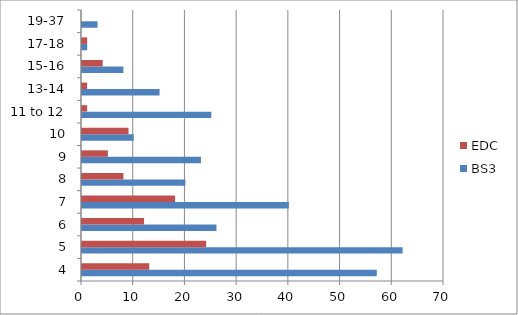
| Category | BS3 | EDC |
|---|---|---|
| 4 | 57 | 13 |
| 5 | 62 | 24 |
| 6 | 26 | 12 |
| 7 | 40 | 18 |
| 8 | 20 | 8 |
| 9 | 23 | 5 |
| 10 | 10 | 9 |
| 11 to 12 | 25 | 1 |
| 13-14 | 15 | 1 |
| 15-16 | 8 | 4 |
| 17-18 | 1 | 1 |
| 19-37 | 3 | 0 |